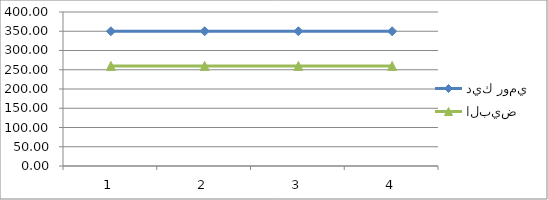
| Category | ديك رومي | البيض |
|---|---|---|
| 0 | 350 | 260 |
| 1 | 350 | 260 |
| 2 | 350 | 260 |
| 3 | 350 | 260 |